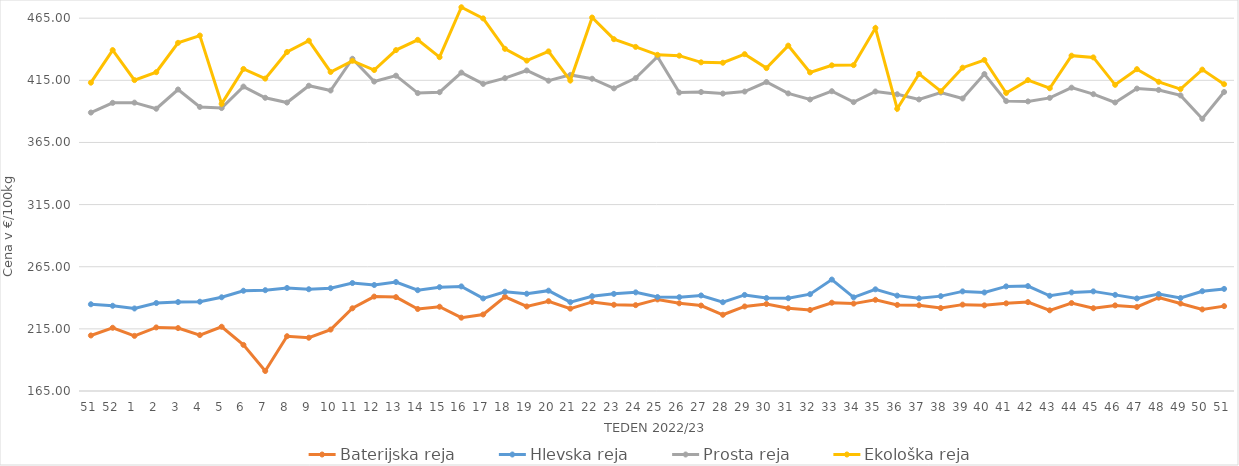
| Category | Baterijska reja | Hlevska reja | Prosta reja | Ekološka reja |
|---|---|---|---|---|
| 51.0 | 209.69 | 234.79 | 389.05 | 413.1 |
| 52.0 | 215.87 | 233.58 | 396.87 | 439.31 |
| 1.0 | 209.37 | 231.41 | 397.04 | 415.17 |
| 2.0 | 216.15 | 235.78 | 392.13 | 421.55 |
| 3.0 | 215.63 | 236.58 | 407.61 | 445.17 |
| 4.0 | 210 | 236.85 | 393.58 | 451.04 |
| 5.0 | 216.7 | 240.42 | 392.67 | 396.03 |
| 6.0 | 202.1 | 245.67 | 409.97 | 424.14 |
| 7.0 | 181.11 | 246.12 | 400.94 | 416.38 |
| 8.0 | 209.08 | 247.88 | 397.11 | 437.76 |
| 9.0 | 207.87 | 246.89 | 410.64 | 446.9 |
| 10.0 | 214.42 | 247.73 | 406.8 | 421.72 |
| 11.0 | 231.56 | 251.88 | 432.34 | 430.69 |
| 12.0 | 240.97 | 250.3 | 414 | 423.28 |
| 13.0 | 240.55 | 252.7 | 418.74 | 439.31 |
| 14.0 | 230.99 | 246.12 | 404.72 | 447.59 |
| 15.0 | 232.82 | 248.56 | 405.42 | 433.62 |
| 16.0 | 224 | 249.17 | 421.22 | 473.79 |
| 17.0 | 226.57 | 239.5 | 412.13 | 464.83 |
| 18.0 | 240.83 | 244.89 | 416.74 | 440.35 |
| 19.0 | 233.05 | 243.26 | 422.93 | 430.86 |
| 20.0 | 237.25 | 245.73 | 414.68 | 438.28 |
| 21.0 | 231.3 | 236.5 | 419.36 | 414.83 |
| 22.0 | 236.67 | 241.27 | 416.27 | 465.52 |
| 23.0 | 234.39 | 243.16 | 408.53 | 448.1 |
| 24.0 | 234.08 | 244.37 | 416.78 | 441.9 |
| 25.0 | 238.69 | 240.6 | 434.05 | 435.52 |
| 26.0 | 235.57 | 240.51 | 405.15 | 434.83 |
| 27.0 | 233.75 | 241.89 | 405.58 | 429.48 |
| 28.0 | 226.35 | 236.46 | 404.32 | 429.14 |
| 29.0 | 233.03 | 242.31 | 405.96 | 436.04 |
| 30.0 | 235 | 239.8 | 413.63 | 424.83 |
| 31.0 | 231.55 | 239.67 | 404.46 | 442.93 |
| 32.0 | 230.2 | 242.89 | 399.57 | 421.38 |
| 33.0 | 236.04 | 254.68 | 406.23 | 427.07 |
| 34.0 | 235.32 | 240.35 | 397.45 | 427.24 |
| 35.0 | 238.39 | 246.82 | 406 | 457.07 |
| 36.0 | 234.27 | 241.75 | 403.79 | 392.07 |
| 37.0 | 234 | 239.58 | 399.61 | 420.17 |
| 38.0 | 231.74 | 241.34 | 405.14 | 406.21 |
| 39.0 | 234.5 | 245.15 | 400.39 | 425.17 |
| 40.0 | 233.92 | 244.29 | 420.04 | 431.38 |
| 41.0 | 235.54 | 249.18 | 398.28 | 404.83 |
| 42.0 | 236.54 | 249.42 | 398.03 | 415.17 |
| 43.0 | 229.92 | 241.62 | 400.86 | 408.62 |
| 44.0 | 235.77 | 244.36 | 409.1 | 434.83 |
| 45.0 | 231.6 | 245.16 | 403.86 | 433.45 |
| 46.0 | 233.89 | 242.36 | 397.17 | 411.38 |
| 47.0 | 232.62 | 239.48 | 408.34 | 423.97 |
| 48.0 | 240.11 | 243.04 | 407.25 | 413.79 |
| 49.0 | 235.41 | 239.81 | 402.87 | 407.93 |
| 50.0 | 230.65 | 245.3 | 384.02 | 423.62 |
| 51.0 | 233.3 | 247.16 | 405.6 | 411.9 |